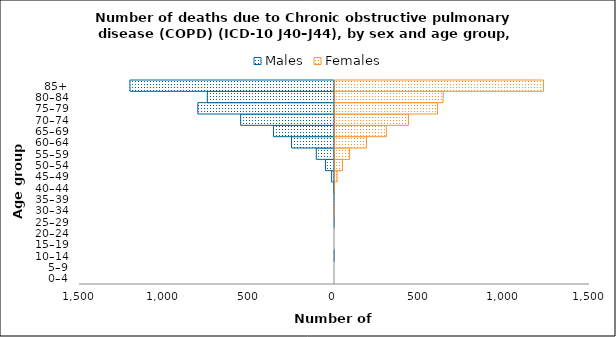
| Category | Males | Females |
|---|---|---|
| 0–4 | 0 | 0 |
| 5–9 | 0 | 0 |
| 10–14 | -1 | 0 |
| 15–19 | 0 | 0 |
| 20–24 | 0 | 0 |
| 25–29 | -1 | 0 |
| 30–34 | -2 | 1 |
| 35–39 | -2 | 0 |
| 40–44 | -5 | 3 |
| 45–49 | -17 | 18 |
| 50–54 | -53 | 50 |
| 55–59 | -107 | 92 |
| 60–64 | -253 | 191 |
| 65–69 | -359 | 308 |
| 70–74 | -552 | 438 |
| 75–79 | -804 | 609 |
| 80–84 | -748 | 642 |
| 85+ | -1203 | 1232 |